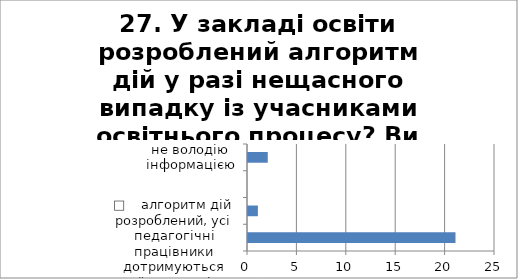
| Category | 27. У закладі освіти розроблений алгоритм дій у разі нещасного випадку із учасниками освітнього процесу? Ви дотримуєтесь його? |
|---|---|
| □    алгоритм дій розроблений, усі педагогічні працівники дотримуються його у разі нещасного випадку; | 21 |
| □    алгоритм дій розроблений, але Ви з ним не ознайомлений/на; | 1 |
| □    алгоритм дій розроблений, але я ним не користуюся, навіть за потреби; | 0 |
| не володію інформацією | 2 |